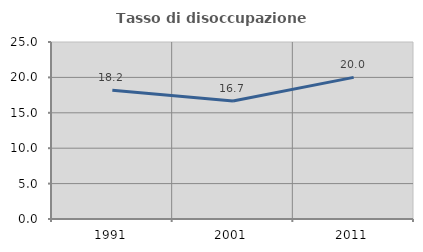
| Category | Tasso di disoccupazione giovanile  |
|---|---|
| 1991.0 | 18.182 |
| 2001.0 | 16.667 |
| 2011.0 | 20 |